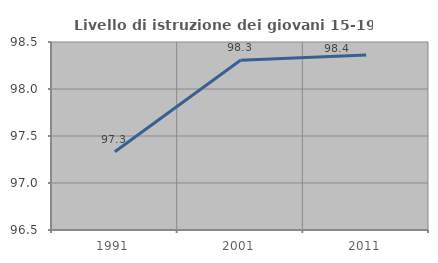
| Category | Livello di istruzione dei giovani 15-19 anni |
|---|---|
| 1991.0 | 97.333 |
| 2001.0 | 98.305 |
| 2011.0 | 98.361 |